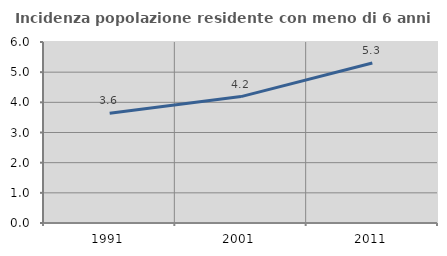
| Category | Incidenza popolazione residente con meno di 6 anni |
|---|---|
| 1991.0 | 3.641 |
| 2001.0 | 4.19 |
| 2011.0 | 5.303 |